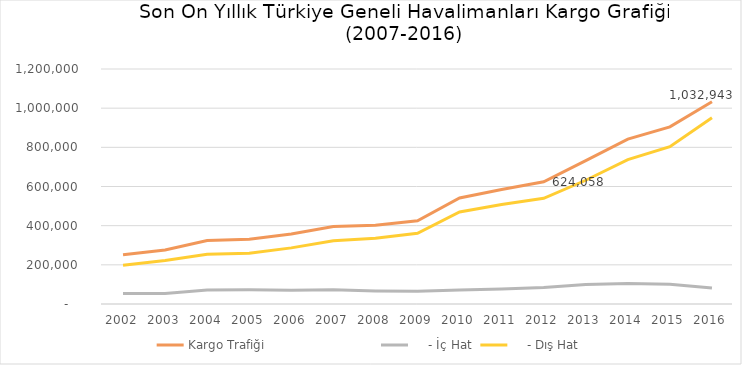
| Category | Kargo Trafiği                             |     - İç Hat |     - Dış Hat |
|---|---|---|---|
| 2002.0 | 251987 | 53640 | 198347 |
| 2003.0 | 276283 | 54104 | 222179 |
| 2004.0 | 324588 | 70998 | 253590 |
| 2005.0 | 331116 | 72204 | 258912 |
| 2006.0 | 357221 | 70698 | 286523 |
| 2007.0 | 395831 | 73252 | 322579 |
| 2008.0 | 402039 | 66554 | 335485 |
| 2009.0 | 425228 | 64518 | 360710 |
| 2010.0 | 541357 | 71216 | 470141 |
| 2011.0 | 584475 | 76269 | 508206 |
| 2012.0 | 624058 | 84431 | 539627 |
| 2013.0 | 731962 | 100097 | 631865 |
| 2014.0 | 842241.493 | 104941.1 | 737300.393 |
| 2015.0 | 904761.757 | 101447.367 | 803314.39 |
| 2016.0 | 1032943.403 | 81587.264 | 951356.139 |